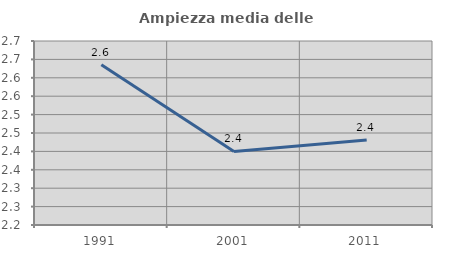
| Category | Ampiezza media delle famiglie |
|---|---|
| 1991.0 | 2.636 |
| 2001.0 | 2.4 |
| 2011.0 | 2.431 |